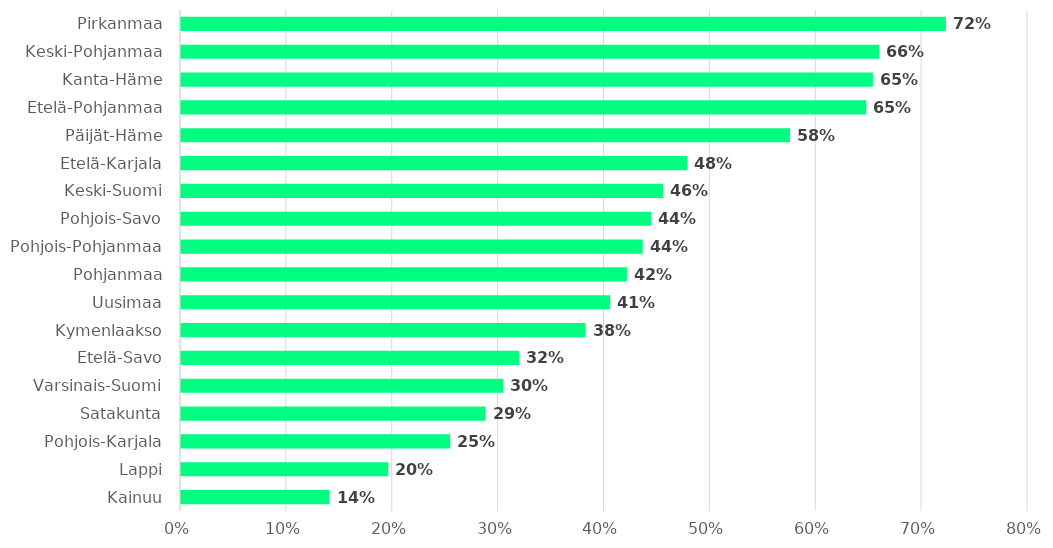
| Category | Series 0 |
|---|---|
| Kainuu | 0.14 |
| Lappi | 0.196 |
| Pohjois-Karjala | 0.254 |
| Satakunta | 0.288 |
| Varsinais-Suomi | 0.304 |
| Etelä-Savo | 0.32 |
| Kymenlaakso | 0.382 |
| Uusimaa | 0.405 |
| Pohjanmaa | 0.421 |
| Pohjois-Pohjanmaa | 0.436 |
| Pohjois-Savo | 0.444 |
| Keski-Suomi | 0.455 |
| Etelä-Karjala | 0.478 |
| Päijät-Häme | 0.575 |
| Etelä-Pohjanmaa | 0.647 |
| Kanta-Häme | 0.654 |
| Keski-Pohjanmaa | 0.659 |
| Pirkanmaa | 0.722 |